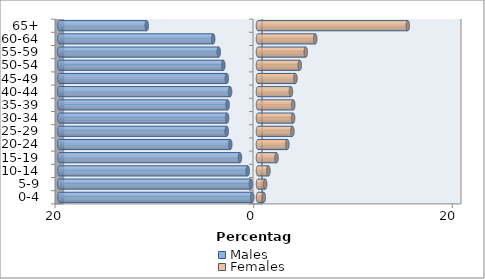
| Category | Males | Females |
|---|---|---|
| 0-4 | -0.572 | 0.582 |
| 5-9 | -0.711 | 0.722 |
| 10-14 | -1.033 | 1.048 |
| 15-19 | -1.817 | 1.866 |
| 20-24 | -2.792 | 2.952 |
| 25-29 | -3.15 | 3.463 |
| 30-34 | -3.11 | 3.532 |
| 35-39 | -3.058 | 3.548 |
| 40-44 | -2.808 | 3.318 |
| 45-49 | -3.142 | 3.769 |
| 50-54 | -3.49 | 4.201 |
| 55-59 | -3.95 | 4.811 |
| 60-64 | -4.512 | 5.762 |
| 65+ | -11.197 | 15.084 |